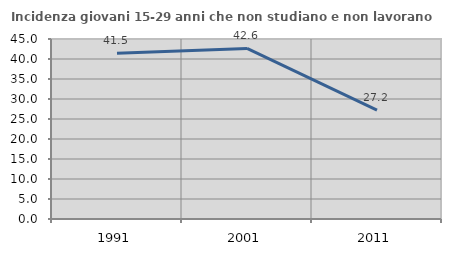
| Category | Incidenza giovani 15-29 anni che non studiano e non lavorano  |
|---|---|
| 1991.0 | 41.463 |
| 2001.0 | 42.642 |
| 2011.0 | 27.222 |